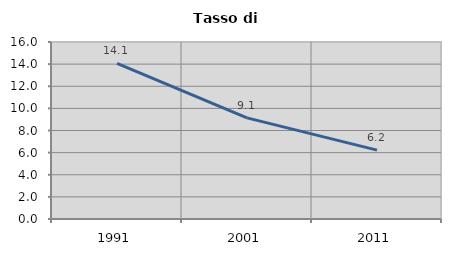
| Category | Tasso di disoccupazione   |
|---|---|
| 1991.0 | 14.064 |
| 2001.0 | 9.144 |
| 2011.0 | 6.229 |